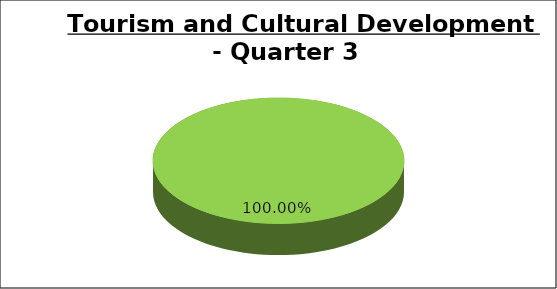
| Category | Green | Amber | Red |
|---|---|---|---|
| Q3 | 1 | 0 | 0 |